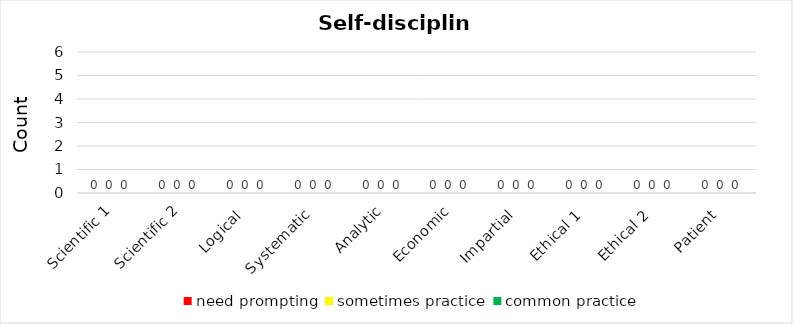
| Category | need prompting | sometimes practice | common practice |
|---|---|---|---|
| Scientific 1 | 0 | 0 | 0 |
| Scientific 2 | 0 | 0 | 0 |
| Logical | 0 | 0 | 0 |
| Systematic | 0 | 0 | 0 |
| Analytic | 0 | 0 | 0 |
| Economic | 0 | 0 | 0 |
| Impartial | 0 | 0 | 0 |
| Ethical 1 | 0 | 0 | 0 |
| Ethical 2 | 0 | 0 | 0 |
| Patient | 0 | 0 | 0 |